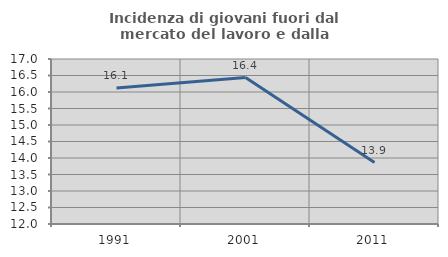
| Category | Incidenza di giovani fuori dal mercato del lavoro e dalla formazione  |
|---|---|
| 1991.0 | 16.118 |
| 2001.0 | 16.438 |
| 2011.0 | 13.861 |